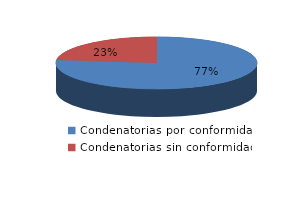
| Category | Series 0 |
|---|---|
| 0 | 436 |
| 1 | 132 |